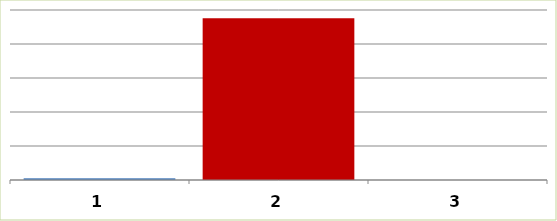
| Category | Series 0 |
|---|---|
| 0 | 25000 |
| 1 | 2377500 |
| 2 | 0 |